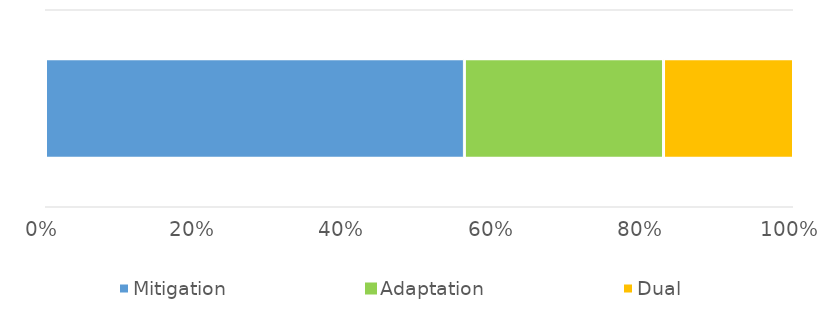
| Category | Mitigation | Adaptation | Dual  |
|---|---|---|---|
| 0 | 36850068 | 17514811 | 11431915 |